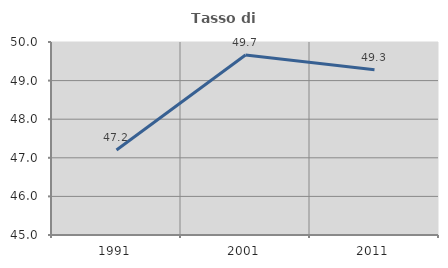
| Category | Tasso di occupazione   |
|---|---|
| 1991.0 | 47.202 |
| 2001.0 | 49.662 |
| 2011.0 | 49.278 |